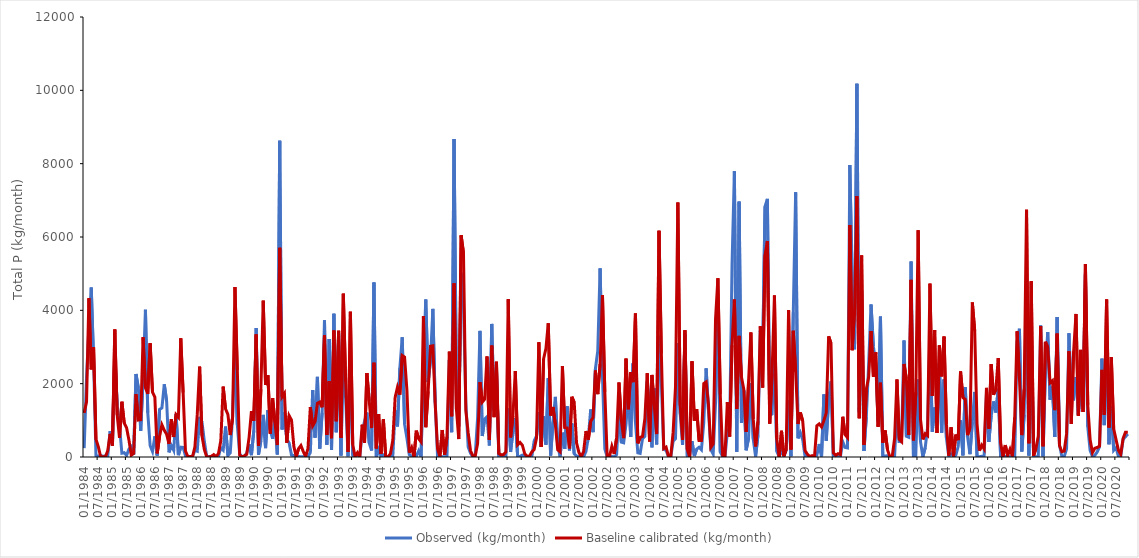
| Category | Observed (kg/month) | Baseline calibrated (kg/month) |
|---|---|---|
| 1984-01-01 | 242.606 | 1202 |
| 1984-02-01 | 2168.971 | 1508 |
| 1984-03-01 | 3535.485 | 4329 |
| 1984-04-01 | 4622.731 | 2390 |
| 1984-05-01 | 2644.497 | 2990 |
| 1984-06-01 | 37.439 | 485.7 |
| 1984-07-01 | 24.106 | 282.9 |
| 1984-08-01 | 42.912 | 6.857 |
| 1984-09-01 | 18.872 | 5.116 |
| 1984-10-01 | 25.433 | 2.722 |
| 1984-11-01 | 22.361 | 172.9 |
| 1984-12-01 | 705.81 | 631.7 |
| 1985-01-01 | 385.065 | 308 |
| 1985-02-01 | 2825.613 | 3477 |
| 1985-03-01 | 1421.982 | 1146 |
| 1985-04-01 | 842.001 | 524.9 |
| 1985-05-01 | 102.659 | 1507 |
| 1985-06-01 | 116.793 | 925.6 |
| 1985-07-01 | 44.34 | 794 |
| 1985-08-01 | 214.746 | 463.8 |
| 1985-09-01 | 280.628 | 48.71 |
| 1985-10-01 | 53.194 | 98.13 |
| 1985-11-01 | 2264.348 | 1713 |
| 1985-12-01 | 1884.649 | 1009 |
| 1986-01-01 | 713.542 | 1016 |
| 1986-02-01 | 2136.945 | 3267 |
| 1986-03-01 | 4015.272 | 1888 |
| 1986-04-01 | 1203.909 | 1723 |
| 1986-05-01 | 306.472 | 3102 |
| 1986-06-01 | 148.972 | 1769 |
| 1986-07-01 | 564.388 | 1633 |
| 1986-08-01 | 39.565 | 98.88 |
| 1986-09-01 | 1297.528 | 562.7 |
| 1986-10-01 | 1338.893 | 876.6 |
| 1986-11-01 | 1982.888 | 728.4 |
| 1986-12-01 | 1522.79 | 620.1 |
| 1987-01-01 | 127.352 | 360.2 |
| 1987-02-01 | 309.939 | 1026 |
| 1987-03-01 | 180.155 | 546.1 |
| 1987-04-01 | 1175.054 | 1158 |
| 1987-05-01 | 50.527 | 1082 |
| 1987-06-01 | 267.755 | 3238 |
| 1987-07-01 | 261.476 | 1754 |
| 1987-08-01 | 27.892 | 163.4 |
| 1987-09-01 | 17.732 | 8.276 |
| 1987-10-01 | 11.503 | 12.61 |
| 1987-11-01 | 16.163 | 13.86 |
| 1987-12-01 | 177.92 | 275.7 |
| 1988-01-01 | 157.448 | 1162 |
| 1988-02-01 | 1095.648 | 2465 |
| 1988-03-01 | 953.42 | 580.1 |
| 1988-04-01 | 432.558 | 206.5 |
| 1988-05-01 | 15.04 | 5.459 |
| 1988-06-01 | 15.73 | 0.466 |
| 1988-07-01 | 11.744 | 20.15 |
| 1988-08-01 | 35.32 | 65.19 |
| 1988-09-01 | 11.941 | 8.087 |
| 1988-10-01 | 15.352 | 93.83 |
| 1988-11-01 | 252.105 | 447.8 |
| 1988-12-01 | 187.876 | 1920 |
| 1989-01-01 | 830.671 | 1311 |
| 1989-02-01 | 41.222 | 1164 |
| 1989-03-01 | 112.958 | 599.9 |
| 1989-04-01 | 1115.684 | 1080 |
| 1989-05-01 | 2984.617 | 4635 |
| 1989-06-01 | 879.756 | 2372 |
| 1989-07-01 | 83.589 | 49.86 |
| 1989-08-01 | 11.239 | 4.752 |
| 1989-09-01 | 10.127 | 31.28 |
| 1989-10-01 | 103.954 | 70.89 |
| 1989-11-01 | 346.32 | 535.6 |
| 1989-12-01 | 50.361 | 1250 |
| 1990-01-01 | 717.343 | 989.2 |
| 1990-02-01 | 3518.985 | 3341 |
| 1990-03-01 | 62.986 | 301.9 |
| 1990-04-01 | 444.903 | 1849 |
| 1990-05-01 | 1148.297 | 4265 |
| 1990-06-01 | 243.931 | 1963 |
| 1990-07-01 | 1282.479 | 2229 |
| 1990-08-01 | 723.952 | 636.2 |
| 1990-09-01 | 497.224 | 1604 |
| 1990-10-01 | 1052.346 | 941.1 |
| 1990-11-01 | 71.072 | 324.5 |
| 1990-12-01 | 8625.64 | 5704 |
| 1991-01-01 | 751.73 | 1638 |
| 1991-02-01 | 1208.032 | 1736 |
| 1991-03-01 | 485.899 | 389.1 |
| 1991-04-01 | 383.503 | 1127 |
| 1991-05-01 | 52.015 | 1007 |
| 1991-06-01 | 36.917 | 291.1 |
| 1991-07-01 | 10.205 | 9.835 |
| 1991-08-01 | 12.736 | 227.4 |
| 1991-09-01 | 6.839 | 312.7 |
| 1991-10-01 | 9.037 | 148.9 |
| 1991-11-01 | 6.139 | 14.99 |
| 1991-12-01 | 6.029 | 229.7 |
| 1992-01-01 | 123.839 | 1363 |
| 1992-02-01 | 1823.884 | 850.3 |
| 1992-03-01 | 529.356 | 964.4 |
| 1992-04-01 | 2185.983 | 1464 |
| 1992-05-01 | 228.197 | 1500 |
| 1992-06-01 | 1204.441 | 1355 |
| 1992-07-01 | 3727.142 | 3322 |
| 1992-08-01 | 333.206 | 600 |
| 1992-09-01 | 3217.317 | 2071 |
| 1992-10-01 | 197.224 | 513.4 |
| 1992-11-01 | 3905.24 | 3452 |
| 1992-12-01 | 677.254 | 974.8 |
| 1993-01-01 | 3362.611 | 3444 |
| 1993-02-01 | 40.225 | 518.2 |
| 1993-03-01 | 2958.972 | 4455 |
| 1993-04-01 | 1611.268 | 2044 |
| 1993-05-01 | 18.228 | 140.2 |
| 1993-06-01 | 2771.236 | 3961 |
| 1993-07-01 | 46.528 | 341.4 |
| 1993-08-01 | 6.956 | 5.092 |
| 1993-09-01 | 6.163 | 115.3 |
| 1993-10-01 | 12.349 | 8.838 |
| 1993-11-01 | 695.894 | 880.2 |
| 1993-12-01 | 969.764 | 386.3 |
| 1994-01-01 | 1207.691 | 2289 |
| 1994-02-01 | 381.436 | 1533 |
| 1994-03-01 | 178.365 | 789.4 |
| 1994-04-01 | 4760.923 | 2572 |
| 1994-05-01 | 8.649 | 232.7 |
| 1994-06-01 | 204.935 | 1169 |
| 1994-07-01 | 17.142 | 82.95 |
| 1994-08-01 | 57.483 | 1027 |
| 1994-09-01 | 7.207 | 2.738 |
| 1994-10-01 | 10.093 | 0.362 |
| 1994-11-01 | 7.56 | 89.03 |
| 1994-12-01 | 26.033 | 454.7 |
| 1995-01-01 | 1270.429 | 1628 |
| 1995-02-01 | 834.981 | 1906 |
| 1995-03-01 | 2433.918 | 1701 |
| 1995-04-01 | 3264.553 | 2769 |
| 1995-05-01 | 896.311 | 2724 |
| 1995-06-01 | 511.719 | 1813 |
| 1995-07-01 | 64.001 | 119.8 |
| 1995-08-01 | 21.012 | 257.4 |
| 1995-09-01 | 4.287 | 2.133 |
| 1995-10-01 | 21.508 | 717.7 |
| 1995-11-01 | 169.223 | 495.1 |
| 1995-12-01 | 9.523 | 412.7 |
| 1996-01-01 | 2613.091 | 3838 |
| 1996-02-01 | 4295.383 | 813.1 |
| 1996-03-01 | 2041.563 | 1790 |
| 1996-04-01 | 2631.259 | 3021 |
| 1996-05-01 | 4039.81 | 3034 |
| 1996-06-01 | 1483.09 | 1464 |
| 1996-07-01 | 12.545 | 223.3 |
| 1996-08-01 | 4.793 | 18.08 |
| 1996-09-01 | 4.755 | 736.7 |
| 1996-10-01 | 8.19 | 59.88 |
| 1996-11-01 | 20.668 | 546.3 |
| 1996-12-01 | 2642.151 | 2874 |
| 1997-01-01 | 677.644 | 1113 |
| 1997-02-01 | 8672.637 | 4735 |
| 1997-03-01 | 1988.317 | 1311 |
| 1997-04-01 | 832.8 | 488.4 |
| 1997-05-01 | 5020.548 | 6048 |
| 1997-06-01 | 4157.432 | 5566 |
| 1997-07-01 | 1486.724 | 1274 |
| 1997-08-01 | 271.944 | 662.6 |
| 1997-09-01 | 98.064 | 168.6 |
| 1997-10-01 | 7.085 | 30.35 |
| 1997-11-01 | 59.048 | 28.97 |
| 1997-12-01 | 1070.007 | 363 |
| 1998-01-01 | 3439.197 | 2044 |
| 1998-02-01 | 571.967 | 1498 |
| 1998-03-01 | 1037.785 | 1579 |
| 1998-04-01 | 1098.304 | 2743 |
| 1998-05-01 | 314.953 | 462.7 |
| 1998-06-01 | 3629.599 | 3038 |
| 1998-07-01 | 1264.358 | 1088 |
| 1998-08-01 | 2402.992 | 2598 |
| 1998-09-01 | 10.226 | 92.91 |
| 1998-10-01 | 5.879 | 58.43 |
| 1998-11-01 | 5.845 | 68.81 |
| 1998-12-01 | 6.513 | 137.3 |
| 1999-01-01 | 1323.371 | 4306 |
| 1999-02-01 | 136.692 | 536 |
| 1999-03-01 | 702.754 | 1122 |
| 1999-04-01 | 1052.24 | 2345 |
| 1999-05-01 | 12.175 | 335.4 |
| 1999-06-01 | 16.085 | 398.9 |
| 1999-07-01 | 52.328 | 322.4 |
| 1999-08-01 | 19.674 | 87.09 |
| 1999-09-01 | 6.857 | 19.55 |
| 1999-10-01 | 8.346 | 21.1 |
| 1999-11-01 | 6.13 | 136.7 |
| 1999-12-01 | 436.927 | 205.7 |
| 2000-01-01 | 572.921 | 518.6 |
| 2000-02-01 | 1221.591 | 3128 |
| 2000-03-01 | 277.135 | 277 |
| 2000-04-01 | 1118.25 | 2672 |
| 2000-05-01 | 336.09 | 2956 |
| 2000-06-01 | 2152.183 | 3648 |
| 2000-07-01 | 40.873 | 1134 |
| 2000-08-01 | 961.017 | 1364 |
| 2000-09-01 | 1640.446 | 888 |
| 2000-10-01 | 327.929 | 199.2 |
| 2000-11-01 | 12.522 | 141.7 |
| 2000-12-01 | 662.197 | 2483 |
| 2001-01-01 | 221.521 | 799.6 |
| 2001-02-01 | 1382.131 | 794.7 |
| 2001-03-01 | 182.123 | 235.4 |
| 2001-04-01 | 917.373 | 1642 |
| 2001-05-01 | 87.117 | 1490 |
| 2001-06-01 | 26.9 | 384.5 |
| 2001-07-01 | 9.795 | 124.9 |
| 2001-08-01 | 10.249 | 7.24 |
| 2001-09-01 | 4.596 | 148.1 |
| 2001-10-01 | 153.666 | 708 |
| 2001-11-01 | 526.891 | 474.1 |
| 2001-12-01 | 1296.182 | 973.4 |
| 2002-01-01 | 677.859 | 1078 |
| 2002-02-01 | 2401.273 | 2358 |
| 2002-03-01 | 2889.745 | 1715 |
| 2002-04-01 | 5144.16 | 2530 |
| 2002-05-01 | 2206.176 | 4414 |
| 2002-06-01 | 218.851 | 1778 |
| 2002-07-01 | 7.822 | 5.642 |
| 2002-08-01 | 9.085 | 17.11 |
| 2002-09-01 | 13.38 | 292.4 |
| 2002-10-01 | 6.451 | 82.45 |
| 2002-11-01 | 65.137 | 520.1 |
| 2002-12-01 | 1296.959 | 2031 |
| 2003-01-01 | 407.667 | 1001 |
| 2003-02-01 | 387.333 | 514.1 |
| 2003-03-01 | 898.44 | 2682 |
| 2003-04-01 | 1817.396 | 1303 |
| 2003-05-01 | 550.163 | 2313 |
| 2003-06-01 | 2552.602 | 2041 |
| 2003-07-01 | 947.228 | 3913 |
| 2003-08-01 | 112.869 | 372.4 |
| 2003-09-01 | 96.122 | 534.9 |
| 2003-10-01 | 498.45 | 560.2 |
| 2003-11-01 | 564.714 | 1044 |
| 2003-12-01 | 2071.819 | 2284 |
| 2004-01-01 | 1247.703 | 423.6 |
| 2004-02-01 | 263.234 | 2237 |
| 2004-03-01 | 1872.354 | 1395 |
| 2004-04-01 | 343.817 | 627.2 |
| 2004-05-01 | 3306.591 | 6171 |
| 2004-06-01 | 2011.587 | 2823 |
| 2004-07-01 | 211.408 | 232 |
| 2004-08-01 | 184.233 | 272.5 |
| 2004-09-01 | 7.692 | 24.7 |
| 2004-10-01 | 7.548 | 19.95 |
| 2004-11-01 | 430.454 | 676.6 |
| 2004-12-01 | 497.577 | 1911 |
| 2005-01-01 | 3099.889 | 6942 |
| 2005-02-01 | 1167.859 | 1411 |
| 2005-03-01 | 329.281 | 466.5 |
| 2005-04-01 | 3354.049 | 3458 |
| 2005-05-01 | 27.587 | 214.3 |
| 2005-06-01 | 17.255 | 8.106 |
| 2005-07-01 | 432.681 | 2609 |
| 2005-08-01 | 26.086 | 992.9 |
| 2005-09-01 | 217.172 | 1305 |
| 2005-10-01 | 267.134 | 451.2 |
| 2005-11-01 | 197.337 | 451.7 |
| 2005-12-01 | 937.928 | 2001 |
| 2006-01-01 | 2416.104 | 2046 |
| 2006-02-01 | 1270.451 | 1426 |
| 2006-03-01 | 203.375 | 262.6 |
| 2006-04-01 | 80.176 | 359.9 |
| 2006-05-01 | 1472.258 | 3768 |
| 2006-06-01 | 4139.101 | 4874 |
| 2006-07-01 | 136.298 | 1710 |
| 2006-08-01 | 18.373 | 47.16 |
| 2006-09-01 | 6.72 | 32.56 |
| 2006-10-01 | 667.412 | 1493 |
| 2006-11-01 | 809.18 | 556.9 |
| 2006-12-01 | 5249.001 | 3052 |
| 2007-01-01 | 7795.938 | 4294 |
| 2007-02-01 | 144.902 | 1309 |
| 2007-03-01 | 6965.066 | 3303 |
| 2007-04-01 | 933.636 | 2179 |
| 2007-05-01 | 1818.948 | 1844 |
| 2007-06-01 | 183.855 | 686.5 |
| 2007-07-01 | 504.785 | 2039 |
| 2007-08-01 | 2007.567 | 3397 |
| 2007-09-01 | 486.009 | 1032 |
| 2007-10-01 | 15.502 | 287.8 |
| 2007-11-01 | 593.033 | 968.5 |
| 2007-12-01 | 3444.708 | 3565 |
| 2008-01-01 | 2747.573 | 1894 |
| 2008-02-01 | 6834.413 | 5503 |
| 2008-03-01 | 7040.088 | 5888 |
| 2008-04-01 | 1143.773 | 910.5 |
| 2008-05-01 | 1173.323 | 2282 |
| 2008-06-01 | 2961.893 | 4407 |
| 2008-07-01 | 154.114 | 488.7 |
| 2008-08-01 | 10.787 | 3.871 |
| 2008-09-01 | 184.735 | 715.3 |
| 2008-10-01 | 8.871 | 21.93 |
| 2008-11-01 | 180.698 | 220.8 |
| 2008-12-01 | 1540.399 | 4006 |
| 2009-01-01 | 20.049 | 205.8 |
| 2009-02-01 | 3946.227 | 3442 |
| 2009-03-01 | 7222.745 | 2321 |
| 2009-04-01 | 509.589 | 901.9 |
| 2009-05-01 | 664.22 | 1214 |
| 2009-06-01 | 468.569 | 983 |
| 2009-07-01 | 12.594 | 177.9 |
| 2009-08-01 | 11.221 | 75.36 |
| 2009-09-01 | 4.627 | 10.49 |
| 2009-10-01 | 7.534 | 36.93 |
| 2009-11-01 | 5.969 | 4.894 |
| 2009-12-01 | 46.82 | 851.2 |
| 2010-01-01 | 355.169 | 903.2 |
| 2010-02-01 | 14.569 | 818.8 |
| 2010-03-01 | 1705.972 | 995.1 |
| 2010-04-01 | 442.289 | 1205 |
| 2010-05-01 | 1556.119 | 3291 |
| 2010-06-01 | 2062.56 | 3103 |
| 2010-07-01 | 34.57 | 113.5 |
| 2010-08-01 | 25.692 | 48.01 |
| 2010-09-01 | 9.713 | 91.35 |
| 2010-10-01 | 10.341 | 66.28 |
| 2010-11-01 | 414.57 | 1097 |
| 2010-12-01 | 259.137 | 608.1 |
| 2011-01-01 | 245.373 | 529.4 |
| 2011-02-01 | 7965.133 | 6329 |
| 2011-03-01 | 4768.088 | 2913 |
| 2011-04-01 | 2935.837 | 3992 |
| 2011-05-01 | 10182.587 | 7117 |
| 2011-06-01 | 1222.483 | 1056 |
| 2011-07-01 | 4517.822 | 5495 |
| 2011-08-01 | 166.178 | 332.4 |
| 2011-09-01 | 1091.057 | 1848 |
| 2011-10-01 | 2545.862 | 2182 |
| 2011-11-01 | 4159.289 | 3437 |
| 2011-12-01 | 3015.934 | 2191 |
| 2012-01-01 | 2561.368 | 2853 |
| 2012-02-01 | 965.921 | 823.1 |
| 2012-03-01 | 3828.964 | 2025 |
| 2012-04-01 | 16.389 | 390.1 |
| 2012-05-01 | 25.957 | 723.5 |
| 2012-06-01 | 31.576 | 193.4 |
| 2012-07-01 | 16.498 | 9.486 |
| 2012-08-01 | 11.153 | 17.45 |
| 2012-09-01 | 14.037 | 502.6 |
| 2012-10-01 | 1369.957 | 2112 |
| 2012-11-01 | 387.608 | 482.1 |
| 2012-12-01 | 553.243 | 416.4 |
| 2013-01-01 | 3174.986 | 2538 |
| 2013-02-01 | 563.189 | 2140 |
| 2013-03-01 | 536.614 | 604 |
| 2013-04-01 | 5332.076 | 4831 |
| 2013-05-01 | 30.331 | 453 |
| 2013-06-01 | 40.209 | 1761 |
| 2013-07-01 | 2112.886 | 6182 |
| 2013-08-01 | 419.768 | 1023 |
| 2013-09-01 | 9.283 | 480.1 |
| 2013-10-01 | 254.893 | 637.4 |
| 2013-11-01 | 809.154 | 583.4 |
| 2013-12-01 | 3366.528 | 4729 |
| 2014-01-01 | 689.602 | 1667 |
| 2014-02-01 | 1348.693 | 3465 |
| 2014-03-01 | 928.57 | 654.9 |
| 2014-04-01 | 2569.786 | 3043 |
| 2014-05-01 | 664.271 | 2201 |
| 2014-06-01 | 2117.96 | 3285 |
| 2014-07-01 | 522.377 | 895.7 |
| 2014-08-01 | 9.98 | 38.31 |
| 2014-09-01 | 86.767 | 810.5 |
| 2014-10-01 | 13.226 | 19.84 |
| 2014-11-01 | 46.309 | 610.3 |
| 2014-12-01 | 291.165 | 461.1 |
| 2015-01-01 | 1001.947 | 2333 |
| 2015-02-01 | 42.987 | 1624 |
| 2015-03-01 | 1902.516 | 1568 |
| 2015-04-01 | 544.626 | 595.9 |
| 2015-05-01 | 76.7 | 796.6 |
| 2015-06-01 | 961.379 | 4215 |
| 2015-07-01 | 1774.534 | 3445 |
| 2015-08-01 | 11.501 | 897.5 |
| 2015-09-01 | 7.741 | 172.6 |
| 2015-10-01 | 18.24 | 323.5 |
| 2015-11-01 | 14.656 | 222.9 |
| 2015-12-01 | 1715.006 | 1885 |
| 2016-01-01 | 409.522 | 770.4 |
| 2016-02-01 | 1121.13 | 2534 |
| 2016-03-01 | 1515.522 | 1698 |
| 2016-04-01 | 1213.958 | 1847 |
| 2016-05-01 | 1858.715 | 2698 |
| 2016-06-01 | 16.408 | 394.7 |
| 2016-07-01 | 11.324 | 12.93 |
| 2016-08-01 | 13.18 | 324.5 |
| 2016-09-01 | 7.473 | 35.69 |
| 2016-10-01 | 8.588 | 210.8 |
| 2016-11-01 | 8.034 | 16.67 |
| 2016-12-01 | 25.843 | 1085 |
| 2017-01-01 | 3159.566 | 3428 |
| 2017-02-01 | 3497.534 | 2149 |
| 2017-03-01 | 150.043 | 598.4 |
| 2017-04-01 | 1148.459 | 1847 |
| 2017-05-01 | 4759.073 | 6745 |
| 2017-06-01 | 38.222 | 373.6 |
| 2017-07-01 | 3616.837 | 4795 |
| 2017-08-01 | 7.426 | 35.31 |
| 2017-09-01 | 8.032 | 234.7 |
| 2017-10-01 | 12.208 | 569.7 |
| 2017-11-01 | 3588.317 | 3575 |
| 2017-12-01 | 17.321 | 294.5 |
| 2018-01-01 | 2335.889 | 3141 |
| 2018-02-01 | 3405.855 | 3000 |
| 2018-03-01 | 1560.129 | 2023 |
| 2018-04-01 | 1915.049 | 2081 |
| 2018-05-01 | 545.235 | 1279 |
| 2018-06-01 | 3816.161 | 3365 |
| 2018-07-01 | 328.205 | 308.1 |
| 2018-08-01 | 13.318 | 144.5 |
| 2018-09-01 | 11.555 | 163 |
| 2018-10-01 | 219.844 | 629.9 |
| 2018-11-01 | 3376.141 | 2886 |
| 2018-12-01 | 1611.862 | 903.9 |
| 2019-01-01 | 1585.366 | 2879 |
| 2019-02-01 | 2181.349 | 3902 |
| 2019-03-01 | 1138.989 | 1126 |
| 2019-04-01 | 1903.871 | 2921 |
| 2019-05-01 | 1365.996 | 1228 |
| 2019-06-01 | 4981.833 | 5263 |
| 2019-07-01 | 819.046 | 1410 |
| 2019-08-01 | 178.809 | 466.8 |
| 2019-09-01 | 11.623 | 119.7 |
| 2019-10-01 | 44.057 | 238.7 |
| 2019-11-01 | 138.831 | 258.3 |
| 2019-12-01 | 282.711 | 297.6 |
| 2020-01-01 | 2682.638 | 2377 |
| 2020-02-01 | 868.72 | 1154 |
| 2020-03-01 | 3070.601 | 4295 |
| 2020-04-01 | 348.324 | 806.8 |
| 2020-05-01 | 1378.949 | 2729 |
| 2020-06-01 | 181.837 | 766.6 |
| 2020-07-01 | 255.916 | 474.7 |
| 2020-08-01 | 17.047 | 188.7 |
| 2020-09-01 | 17.855 | 78.91 |
| 2020-10-01 | 480.102 | 505.4 |
| 2020-11-01 | 551.198 | 677.3 |
| 2020-12-01 | 626.755 | 676.9 |